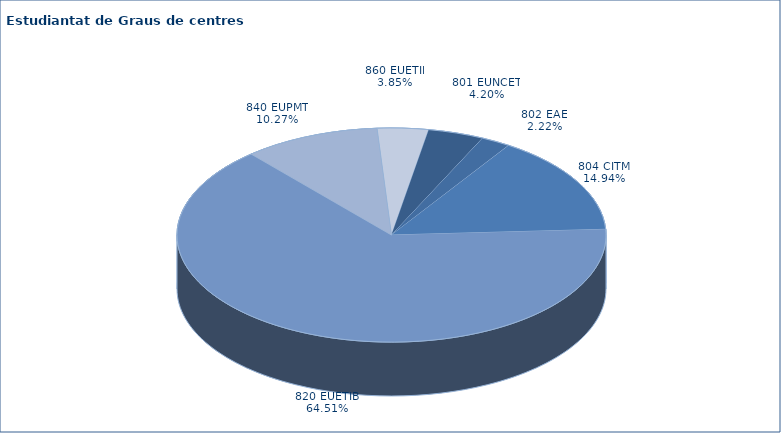
| Category | Series 0 |
|---|---|
| 801 EUNCET | 72 |
| 802 EAE | 38 |
| 804 CITM | 256 |
| 820 EUETIB | 1105 |
| 840 EUPMT | 176 |
| 860 EUETII | 66 |